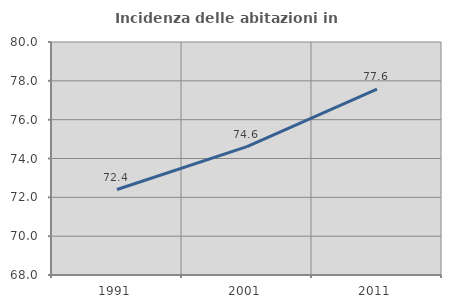
| Category | Incidenza delle abitazioni in proprietà  |
|---|---|
| 1991.0 | 72.403 |
| 2001.0 | 74.612 |
| 2011.0 | 77.571 |